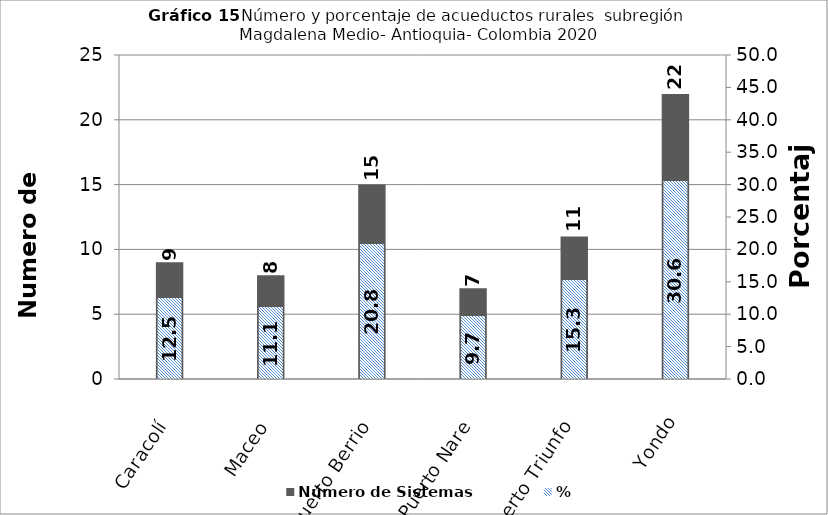
| Category | Número de Sistemas |
|---|---|
| Caracolí | 9 |
| Maceo | 8 |
| Puerto Berrio | 15 |
| Puerto Nare | 7 |
| Puerto Triunfo | 11 |
| Yondo | 22 |